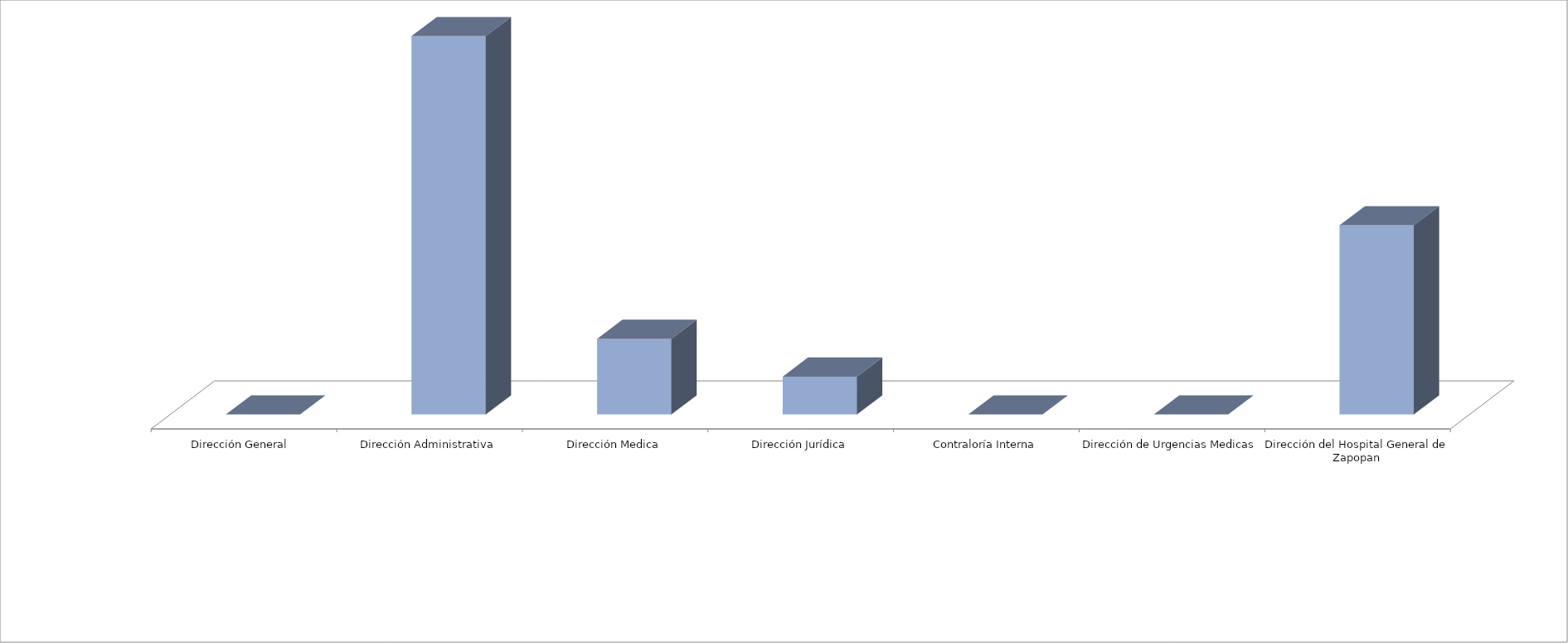
| Category | Series 0 | Series 1 |
|---|---|---|
| Dirección General  |  | 0 |
| Dirección Administrativa |  | 10 |
| Dirección Medica |  | 2 |
| Dirección Jurídica |  | 1 |
| Contraloría Interna |  | 0 |
| Dirección de Urgencias Medicas |  | 0 |
| Dirección del Hospital General de Zapopan |  | 5 |